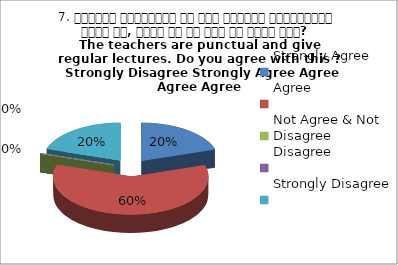
| Category | 7. शिक्षक समयनिष्ट है एवं नियमित व्याख्यान देते है, क्या आप इस बात से सहमत हैं? 
The teachers are punctual and give regular lectures. Do you agree with this ?
 Strongly Disagree Strongly Agree Agree Agree Agree |
|---|---|
| Strongly Agree | 1 |
| Agree | 3 |
| Not Agree & Not Disagree | 0 |
| Disagree | 0 |
| Strongly Disagree | 1 |